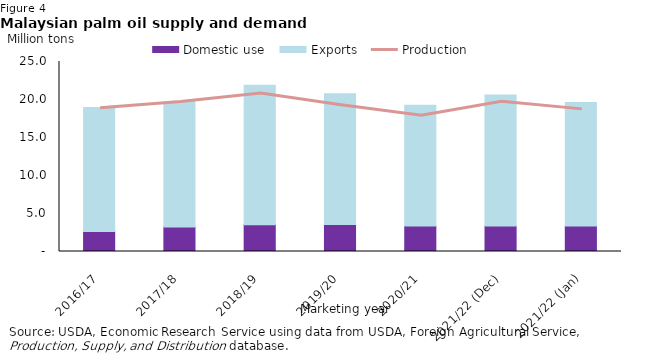
| Category | Domestic use | Exports |
|---|---|---|
| 2016/17 | 2.622 | 16.313 |
| 2017/18 | 3.238 | 16.472 |
| 2018/19 | 3.522 | 18.362 |
| 2019/20 | 3.543 | 17.212 |
| 2020/21 | 3.37 | 15.866 |
| 2021/22 (Dec) | 3.37 | 17.22 |
| 2021/22 (Jan) | 3.37 | 16.22 |